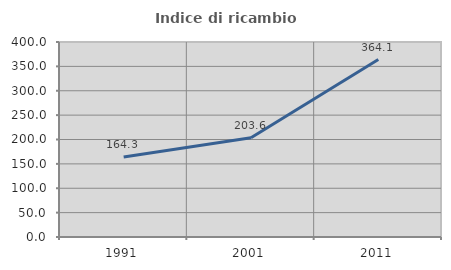
| Category | Indice di ricambio occupazionale  |
|---|---|
| 1991.0 | 164.264 |
| 2001.0 | 203.61 |
| 2011.0 | 364.053 |